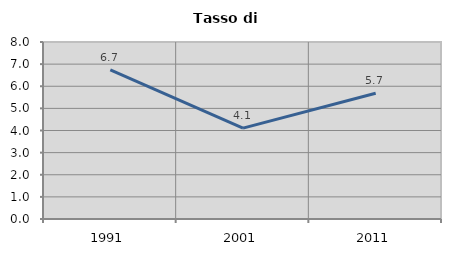
| Category | Tasso di disoccupazione   |
|---|---|
| 1991.0 | 6.741 |
| 2001.0 | 4.107 |
| 2011.0 | 5.685 |